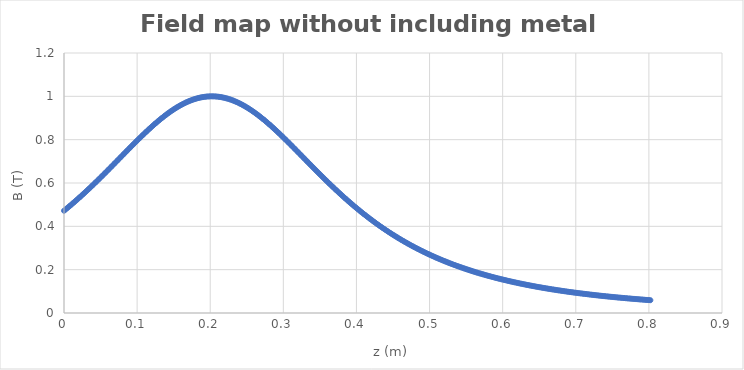
| Category | Series 0 |
|---|---|
| 2e-05 | 0.472 |
| 0.00202 | 0.477 |
| 0.004 | 0.483 |
| 0.00601 | 0.489 |
| 0.00803 | 0.494 |
| 0.01003 | 0.5 |
| 0.01201 | 0.506 |
| 0.01401 | 0.512 |
| 0.01602 | 0.518 |
| 0.01802 | 0.524 |
| 0.02 | 0.53 |
| 0.02201 | 0.536 |
| 0.02403 | 0.542 |
| 0.02603 | 0.548 |
| 0.02801 | 0.554 |
| 0.03001 | 0.56 |
| 0.03203 | 0.567 |
| 0.03404 | 0.573 |
| 0.03601 | 0.579 |
| 0.03801 | 0.586 |
| 0.04002 | 0.592 |
| 0.04203 | 0.599 |
| 0.044 | 0.605 |
| 0.046 | 0.612 |
| 0.04803 | 0.619 |
| 0.05004 | 0.625 |
| 0.05201 | 0.632 |
| 0.05401 | 0.639 |
| 0.05603 | 0.645 |
| 0.05804 | 0.652 |
| 0.06001 | 0.659 |
| 0.06201 | 0.666 |
| 0.06403 | 0.673 |
| 0.06603 | 0.68 |
| 0.068 | 0.686 |
| 0.07001 | 0.693 |
| 0.07203 | 0.7 |
| 0.07404 | 0.707 |
| 0.07601 | 0.714 |
| 0.07801 | 0.721 |
| 0.08003 | 0.728 |
| 0.08203 | 0.735 |
| 0.08401 | 0.741 |
| 0.08602 | 0.748 |
| 0.08803 | 0.755 |
| 0.09004 | 0.762 |
| 0.09201 | 0.769 |
| 0.09401 | 0.776 |
| 0.09603 | 0.782 |
| 0.09804 | 0.789 |
| 0.10002 | 0.796 |
| 0.10202 | 0.803 |
| 0.10403 | 0.809 |
| 0.10604 | 0.816 |
| 0.10802 | 0.822 |
| 0.11002 | 0.829 |
| 0.11203 | 0.835 |
| 0.11404 | 0.841 |
| 0.11601 | 0.848 |
| 0.11801 | 0.854 |
| 0.12003 | 0.86 |
| 0.12204 | 0.866 |
| 0.12402 | 0.872 |
| 0.12602 | 0.878 |
| 0.12804 | 0.884 |
| 0.13004 | 0.889 |
| 0.13202 | 0.895 |
| 0.13401 | 0.9 |
| 0.13603 | 0.906 |
| 0.13804 | 0.911 |
| 0.14001 | 0.916 |
| 0.14201 | 0.921 |
| 0.14402 | 0.926 |
| 0.14603 | 0.931 |
| 0.14801 | 0.935 |
| 0.15001 | 0.94 |
| 0.15203 | 0.944 |
| 0.15404 | 0.948 |
| 0.15602 | 0.952 |
| 0.15802 | 0.956 |
| 0.16004 | 0.96 |
| 0.16204 | 0.964 |
| 0.16401 | 0.967 |
| 0.16601 | 0.97 |
| 0.16802 | 0.973 |
| 0.17003 | 0.976 |
| 0.17201 | 0.979 |
| 0.17401 | 0.982 |
| 0.17603 | 0.984 |
| 0.17804 | 0.987 |
| 0.18002 | 0.989 |
| 0.18201 | 0.991 |
| 0.18403 | 0.992 |
| 0.18604 | 0.994 |
| 0.18802 | 0.995 |
| 0.19001 | 0.997 |
| 0.19202 | 0.998 |
| 0.19403 | 0.998 |
| 0.19601 | 0.999 |
| 0.198 | 1 |
| 0.20002 | 1 |
| 0.20204 | 1 |
| 0.20402 | 1 |
| 0.20601 | 1 |
| 0.20803 | 0.999 |
| 0.21004 | 0.999 |
| 0.21202 | 0.998 |
| 0.214 | 0.997 |
| 0.21602 | 0.996 |
| 0.21802 | 0.994 |
| 0.22 | 0.993 |
| 0.222 | 0.991 |
| 0.22402 | 0.989 |
| 0.22603 | 0.987 |
| 0.22801 | 0.985 |
| 0.23001 | 0.982 |
| 0.23202 | 0.98 |
| 0.23404 | 0.977 |
| 0.23602 | 0.974 |
| 0.23801 | 0.971 |
| 0.24002 | 0.968 |
| 0.24203 | 0.964 |
| 0.24401 | 0.961 |
| 0.246 | 0.957 |
| 0.24802 | 0.953 |
| 0.25003 | 0.949 |
| 0.25202 | 0.945 |
| 0.254 | 0.94 |
| 0.25602 | 0.936 |
| 0.25803 | 0.931 |
| 0.26001 | 0.927 |
| 0.262 | 0.922 |
| 0.26402 | 0.917 |
| 0.26603 | 0.912 |
| 0.26801 | 0.907 |
| 0.27 | 0.901 |
| 0.27202 | 0.896 |
| 0.27403 | 0.89 |
| 0.27601 | 0.885 |
| 0.27801 | 0.879 |
| 0.28002 | 0.873 |
| 0.28203 | 0.867 |
| 0.28401 | 0.861 |
| 0.286 | 0.855 |
| 0.28802 | 0.849 |
| 0.29003 | 0.842 |
| 0.29202 | 0.836 |
| 0.294 | 0.83 |
| 0.29602 | 0.823 |
| 0.29803 | 0.817 |
| 0.30001 | 0.81 |
| 0.302 | 0.804 |
| 0.30402 | 0.797 |
| 0.30603 | 0.79 |
| 0.30802 | 0.784 |
| 0.31 | 0.777 |
| 0.31202 | 0.77 |
| 0.31403 | 0.763 |
| 0.31601 | 0.757 |
| 0.318 | 0.75 |
| 0.32002 | 0.743 |
| 0.32202 | 0.736 |
| 0.32401 | 0.729 |
| 0.326 | 0.722 |
| 0.32802 | 0.715 |
| 0.33004 | 0.708 |
| 0.33201 | 0.701 |
| 0.334 | 0.695 |
| 0.33602 | 0.688 |
| 0.33803 | 0.681 |
| 0.34001 | 0.674 |
| 0.34201 | 0.667 |
| 0.34402 | 0.66 |
| 0.34602 | 0.654 |
| 0.34801 | 0.647 |
| 0.34999 | 0.64 |
| 0.35202 | 0.633 |
| 0.35403 | 0.627 |
| 0.35603 | 0.62 |
| 0.358 | 0.613 |
| 0.36002 | 0.607 |
| 0.36203 | 0.6 |
| 0.36402 | 0.594 |
| 0.366 | 0.587 |
| 0.36801 | 0.581 |
| 0.37003 | 0.574 |
| 0.37202 | 0.568 |
| 0.37399 | 0.562 |
| 0.37601 | 0.556 |
| 0.37803 | 0.549 |
| 0.38002 | 0.543 |
| 0.382 | 0.537 |
| 0.38402 | 0.531 |
| 0.38603 | 0.525 |
| 0.388 | 0.519 |
| 0.38999 | 0.513 |
| 0.39201 | 0.507 |
| 0.39402 | 0.501 |
| 0.39601 | 0.496 |
| 0.39799 | 0.49 |
| 0.4 | 0.484 |
| 0.40201 | 0.479 |
| 0.40401 | 0.473 |
| 0.40599 | 0.468 |
| 0.408 | 0.462 |
| 0.41001 | 0.457 |
| 0.41201 | 0.452 |
| 0.41398 | 0.447 |
| 0.416 | 0.441 |
| 0.41801 | 0.436 |
| 0.42 | 0.431 |
| 0.42198 | 0.426 |
| 0.42399 | 0.421 |
| 0.42601 | 0.416 |
| 0.42801 | 0.411 |
| 0.42998 | 0.406 |
| 0.432 | 0.402 |
| 0.43401 | 0.397 |
| 0.436 | 0.392 |
| 0.43798 | 0.388 |
| 0.44 | 0.383 |
| 0.44201 | 0.379 |
| 0.44401 | 0.374 |
| 0.44598 | 0.37 |
| 0.44799 | 0.365 |
| 0.45 | 0.361 |
| 0.452 | 0.357 |
| 0.45398 | 0.353 |
| 0.456 | 0.349 |
| 0.45801 | 0.344 |
| 0.46001 | 0.34 |
| 0.46199 | 0.336 |
| 0.464 | 0.332 |
| 0.46601 | 0.329 |
| 0.46801 | 0.325 |
| 0.46999 | 0.321 |
| 0.472 | 0.317 |
| 0.47401 | 0.313 |
| 0.476 | 0.31 |
| 0.47799 | 0.306 |
| 0.48 | 0.303 |
| 0.48201 | 0.299 |
| 0.48401 | 0.296 |
| 0.48599 | 0.292 |
| 0.488 | 0.289 |
| 0.49002 | 0.285 |
| 0.49201 | 0.282 |
| 0.49399 | 0.279 |
| 0.49601 | 0.276 |
| 0.49802 | 0.272 |
| 0.50001 | 0.269 |
| 0.502 | 0.266 |
| 0.504 | 0.263 |
| 0.50601 | 0.26 |
| 0.50801 | 0.257 |
| 0.50999 | 0.254 |
| 0.512 | 0.251 |
| 0.51402 | 0.248 |
| 0.51601 | 0.246 |
| 0.51799 | 0.243 |
| 0.52001 | 0.24 |
| 0.52203 | 0.237 |
| 0.52403 | 0.235 |
| 0.526 | 0.232 |
| 0.52801 | 0.229 |
| 0.53003 | 0.227 |
| 0.53203 | 0.224 |
| 0.534 | 0.222 |
| 0.53601 | 0.219 |
| 0.53802 | 0.217 |
| 0.54002 | 0.214 |
| 0.542 | 0.212 |
| 0.54401 | 0.21 |
| 0.54603 | 0.207 |
| 0.54803 | 0.205 |
| 0.55001 | 0.203 |
| 0.55201 | 0.2 |
| 0.55404 | 0.198 |
| 0.55604 | 0.196 |
| 0.558 | 0.194 |
| 0.56001 | 0.192 |
| 0.56202 | 0.19 |
| 0.56402 | 0.187 |
| 0.566 | 0.185 |
| 0.56801 | 0.183 |
| 0.57003 | 0.181 |
| 0.57203 | 0.179 |
| 0.57401 | 0.177 |
| 0.57602 | 0.176 |
| 0.57804 | 0.174 |
| 0.58003 | 0.172 |
| 0.58201 | 0.17 |
| 0.58402 | 0.168 |
| 0.58603 | 0.166 |
| 0.58803 | 0.165 |
| 0.59 | 0.163 |
| 0.59202 | 0.161 |
| 0.59404 | 0.159 |
| 0.59604 | 0.158 |
| 0.59801 | 0.156 |
| 0.60002 | 0.154 |
| 0.60203 | 0.153 |
| 0.60403 | 0.151 |
| 0.60602 | 0.15 |
| 0.60802 | 0.148 |
| 0.61003 | 0.146 |
| 0.61203 | 0.145 |
| 0.61401 | 0.143 |
| 0.61602 | 0.142 |
| 0.61804 | 0.14 |
| 0.62004 | 0.139 |
| 0.62202 | 0.137 |
| 0.62403 | 0.136 |
| 0.62604 | 0.135 |
| 0.62804 | 0.133 |
| 0.63001 | 0.132 |
| 0.63202 | 0.131 |
| 0.63403 | 0.129 |
| 0.63604 | 0.128 |
| 0.63801 | 0.127 |
| 0.64001 | 0.125 |
| 0.64202 | 0.124 |
| 0.64403 | 0.123 |
| 0.646 | 0.122 |
| 0.64801 | 0.12 |
| 0.65003 | 0.119 |
| 0.65203 | 0.118 |
| 0.654 | 0.117 |
| 0.65602 | 0.116 |
| 0.65803 | 0.115 |
| 0.66002 | 0.113 |
| 0.662 | 0.112 |
| 0.664 | 0.111 |
| 0.66602 | 0.11 |
| 0.66803 | 0.109 |
| 0.67 | 0.108 |
| 0.67201 | 0.107 |
| 0.67403 | 0.106 |
| 0.67603 | 0.105 |
| 0.678 | 0.104 |
| 0.68001 | 0.103 |
| 0.68203 | 0.102 |
| 0.68403 | 0.101 |
| 0.68601 | 0.1 |
| 0.68801 | 0.099 |
| 0.69003 | 0.098 |
| 0.69203 | 0.097 |
| 0.694 | 0.096 |
| 0.69601 | 0.095 |
| 0.69803 | 0.094 |
| 0.70004 | 0.093 |
| 0.70201 | 0.092 |
| 0.70402 | 0.092 |
| 0.70603 | 0.091 |
| 0.70803 | 0.09 |
| 0.71 | 0.089 |
| 0.71201 | 0.088 |
| 0.71403 | 0.087 |
| 0.71603 | 0.087 |
| 0.71801 | 0.086 |
| 0.72001 | 0.085 |
| 0.72203 | 0.084 |
| 0.72404 | 0.083 |
| 0.72601 | 0.083 |
| 0.72801 | 0.082 |
| 0.73003 | 0.081 |
| 0.73204 | 0.08 |
| 0.73401 | 0.08 |
| 0.73601 | 0.079 |
| 0.73803 | 0.078 |
| 0.74003 | 0.078 |
| 0.74201 | 0.077 |
| 0.74401 | 0.076 |
| 0.74603 | 0.075 |
| 0.74804 | 0.075 |
| 0.75002 | 0.074 |
| 0.75202 | 0.073 |
| 0.75403 | 0.073 |
| 0.75604 | 0.072 |
| 0.75801 | 0.071 |
| 0.76001 | 0.071 |
| 0.76203 | 0.07 |
| 0.76404 | 0.07 |
| 0.766 | 0.069 |
| 0.76801 | 0.068 |
| 0.77003 | 0.068 |
| 0.77204 | 0.067 |
| 0.77402 | 0.067 |
| 0.77601 | 0.066 |
| 0.77803 | 0.065 |
| 0.78004 | 0.065 |
| 0.78202 | 0.064 |
| 0.78402 | 0.064 |
| 0.78603 | 0.063 |
| 0.78804 | 0.063 |
| 0.79001 | 0.062 |
| 0.79201 | 0.062 |
| 0.79403 | 0.061 |
| 0.79604 | 0.061 |
| 0.79802 | 0.06 |
| 0.80001 | 0.06 |
| 0.80203 | 0.059 |